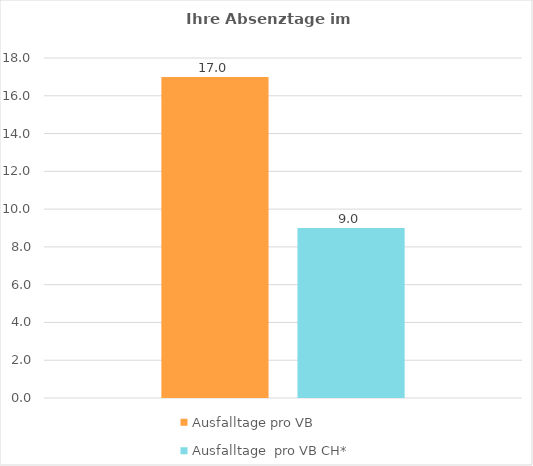
| Category | Ausfalltage pro VB   | Ausfalltage  pro VB CH*  |
|---|---|---|
| 0 | 17 | 9 |